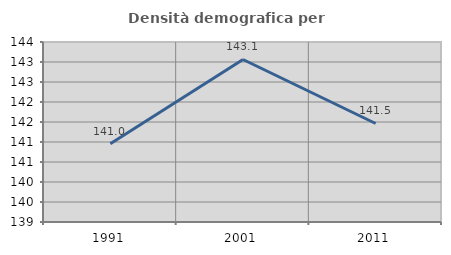
| Category | Densità demografica |
|---|---|
| 1991.0 | 140.956 |
| 2001.0 | 143.063 |
| 2011.0 | 141.463 |